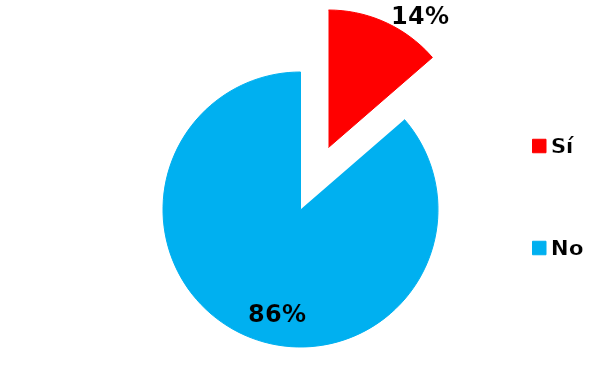
| Category | Series 0 |
|---|---|
| Sí | 6 |
| No | 38 |